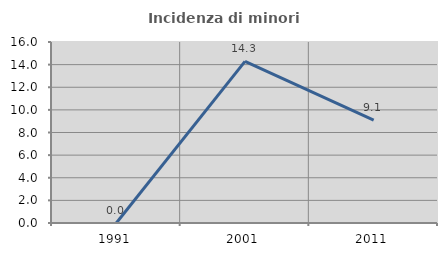
| Category | Incidenza di minori stranieri |
|---|---|
| 1991.0 | 0 |
| 2001.0 | 14.286 |
| 2011.0 | 9.091 |